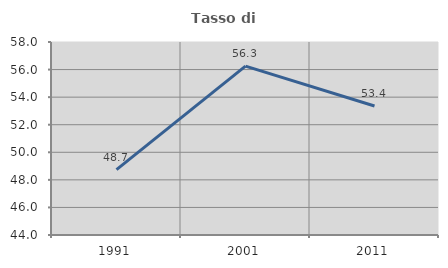
| Category | Tasso di occupazione   |
|---|---|
| 1991.0 | 48.739 |
| 2001.0 | 56.25 |
| 2011.0 | 53.358 |